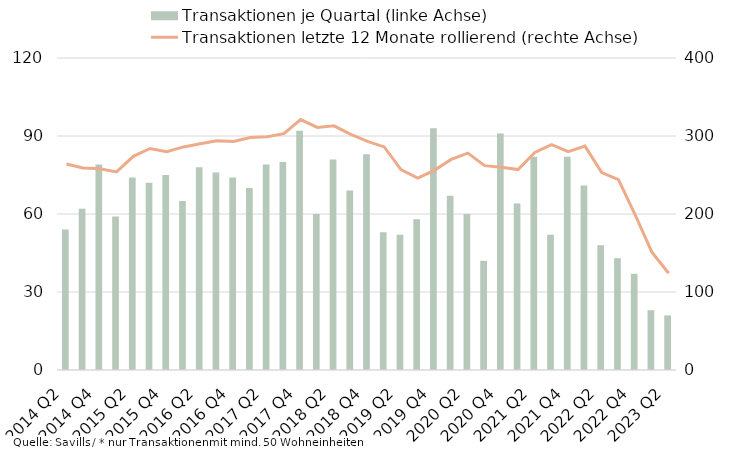
| Category | Transaktionen je Quartal (linke Achse) |
|---|---|
| 2014 Q2 | 54 |
| 2014 Q3 | 62 |
| 2014 Q4 | 79 |
| 2015 Q1 | 59 |
| 2015 Q2 | 74 |
| 2015 Q3 | 72 |
| 2015 Q4 | 75 |
| 2016 Q1 | 65 |
| 2016 Q2 | 78 |
| 2016 Q3 | 76 |
| 2016 Q4 | 74 |
| 2017 Q1 | 70 |
| 2017 Q2 | 79 |
| 2017 Q3 | 80 |
| 2017 Q4 | 92 |
| 2018 Q1 | 60 |
| 2018 Q2 | 81 |
| 2018 Q3 | 69 |
| 2018 Q4 | 83 |
| 2019 Q1 | 53 |
| 2019 Q2 | 52 |
| 2019 Q3 | 58 |
| 2019 Q4 | 93 |
| 2020 Q1 | 67 |
| 2020 Q2 | 60 |
| 2020 Q3 | 42 |
| 2020 Q4 | 91 |
| 2021 Q1 | 64 |
| 2021 Q2 | 82 |
| 2021 Q3 | 52 |
| 2021 Q4 | 82 |
| 2022 Q1 | 71 |
| 2022 Q2 | 48 |
| 2022 Q3 | 43 |
| 2022 Q4 | 37 |
| 2023 Q1 | 23 |
| 2023 Q2 | 21 |